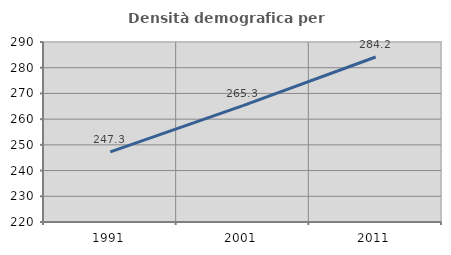
| Category | Densità demografica |
|---|---|
| 1991.0 | 247.268 |
| 2001.0 | 265.28 |
| 2011.0 | 284.158 |